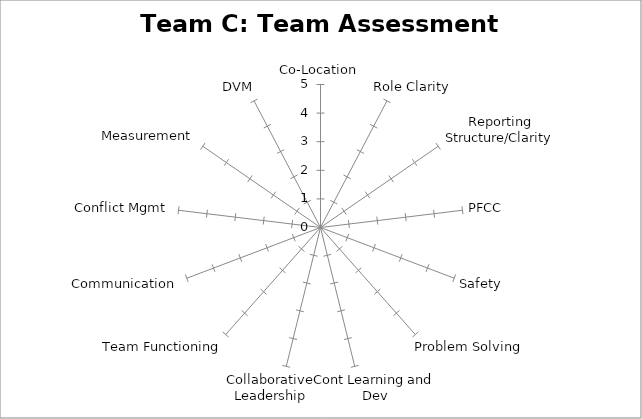
| Category | Series 0 |
|---|---|
| Co-Location | 0 |
| Role Clarity | 0 |
| Reporting Structure/Clarity | 0 |
| PFCC | 0 |
| Safety | 0 |
| Problem Solving | 0 |
| Cont Learning and Dev | 0 |
| Collaborative Leadership | 0 |
| Team Functioning | 0 |
| Communication | 0 |
| Conflict Mgmt | 0 |
| Measurement | 0 |
| DVM | 0 |